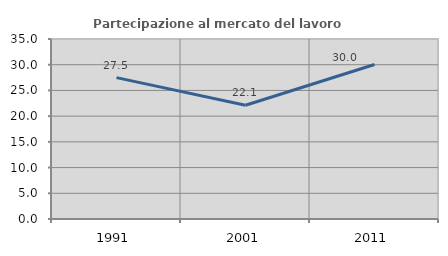
| Category | Partecipazione al mercato del lavoro  femminile |
|---|---|
| 1991.0 | 27.491 |
| 2001.0 | 22.114 |
| 2011.0 | 30.048 |